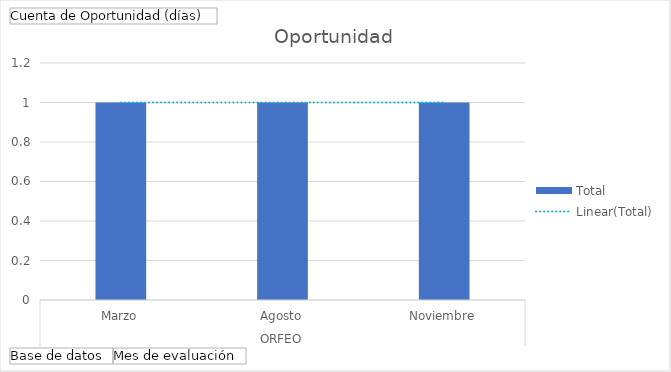
| Category | Total |
|---|---|
| 0 | 1 |
| 1 | 1 |
| 2 | 1 |